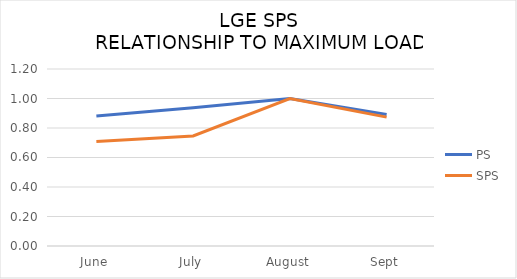
| Category | PS | SPS |
|---|---|---|
| June | 0.881 | 0.709 |
| July | 0.937 | 0.746 |
| August | 1 | 1 |
| Sept | 0.891 | 0.874 |